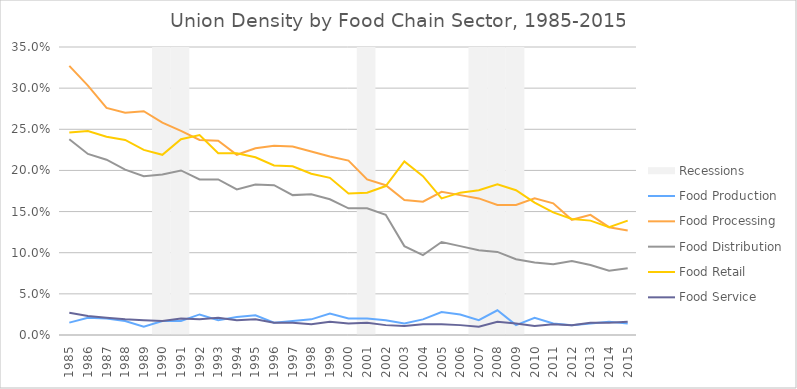
| Category | Recessions |
|---|---|
| 1985.0 | 0 |
| 1986.0 | 0 |
| 1987.0 | 0 |
| 1988.0 | 0 |
| 1989.0 | 0 |
| 1990.0 | 1 |
| 1991.0 | 1 |
| 1992.0 | 0 |
| 1993.0 | 0 |
| 1994.0 | 0 |
| 1995.0 | 0 |
| 1996.0 | 0 |
| 1997.0 | 0 |
| 1998.0 | 0 |
| 1999.0 | 0 |
| 2000.0 | 0 |
| 2001.0 | 1 |
| 2002.0 | 0 |
| 2003.0 | 0 |
| 2004.0 | 0 |
| 2005.0 | 0 |
| 2006.0 | 0 |
| 2007.0 | 1 |
| 2008.0 | 1 |
| 2009.0 | 1 |
| 2010.0 | 0 |
| 2011.0 | 0 |
| 2012.0 | 0 |
| 2013.0 | 0 |
| 2014.0 | 0 |
| 2015.0 | 0 |